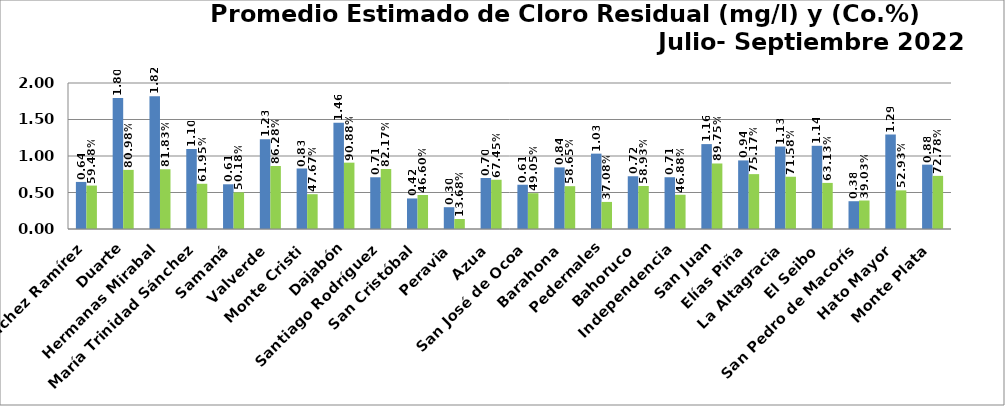
| Category | PROMEDIO TRIMESTRAL (mg/l) | PROMEDIO TRIMESTRAL (Co.%) |
|---|---|---|
| Sánchez Ramírez | 0.645 | 0.595 |
| Duarte | 1.795 | 0.81 |
| Hermanas Mirabal | 1.817 | 0.818 |
| María Trinidad Sánchez | 1.096 | 0.62 |
| Samaná | 0.612 | 0.502 |
| Valverde | 1.229 | 0.863 |
| Monte Cristi | 0.829 | 0.477 |
| Dajabón | 1.456 | 0.909 |
| Santiago Rodríguez | 0.709 | 0.822 |
| San Cristóbal | 0.419 | 0.466 |
| Peravia | 0.299 | 0.137 |
| Azua | 0.699 | 0.674 |
| San José de Ocoa | 0.606 | 0.49 |
| Barahona | 0.844 | 0.586 |
| Pedernales | 1.032 | 0.371 |
| Bahoruco | 0.722 | 0.589 |
| Independencia | 0.709 | 0.469 |
| San Juan | 1.163 | 0.898 |
| Elías Piña | 0.939 | 0.752 |
| La Altagracia | 1.129 | 0.716 |
| El Seibo | 1.14 | 0.631 |
| San Pedro de Macorís | 0.38 | 0.39 |
| Hato Mayor | 1.294 | 0.529 |
| Monte Plata | 0.881 | 0.728 |